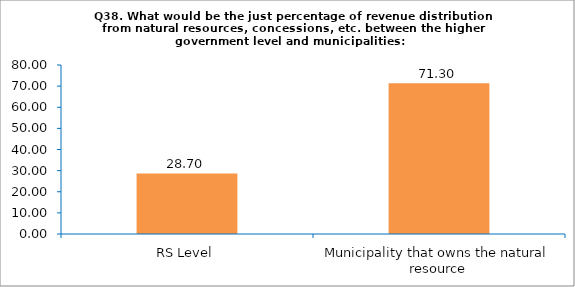
| Category | Series 0 |
|---|---|
| RS Level | 28.698 |
| Municipality that owns the natural resource | 71.302 |